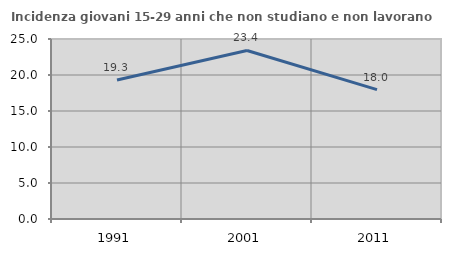
| Category | Incidenza giovani 15-29 anni che non studiano e non lavorano  |
|---|---|
| 1991.0 | 19.304 |
| 2001.0 | 23.404 |
| 2011.0 | 17.978 |